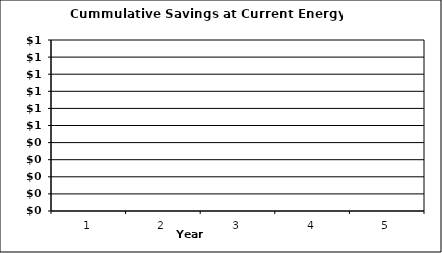
| Category | Cummulative Savings at Current Energy Prices* |
|---|---|
| 0 | 0 |
| 1 | 0 |
| 2 | 0 |
| 3 | 0 |
| 4 | 0 |